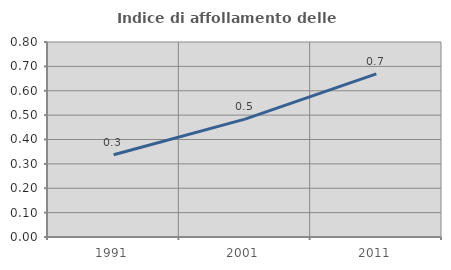
| Category | Indice di affollamento delle abitazioni  |
|---|---|
| 1991.0 | 0.338 |
| 2001.0 | 0.484 |
| 2011.0 | 0.669 |